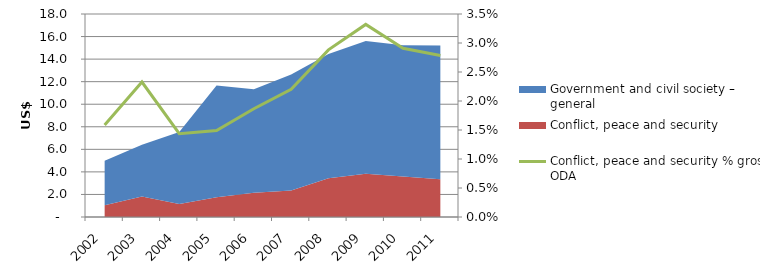
| Category | Conflict, peace and security % gross ODA |
|---|---|
| 0 | 0.016 |
| 1 | 0.023 |
| 2 | 0.014 |
| 3 | 0.015 |
| 4 | 0.019 |
| 5 | 0.022 |
| 6 | 0.029 |
| 7 | 0.033 |
| 8 | 0.029 |
| 9 | 0.028 |